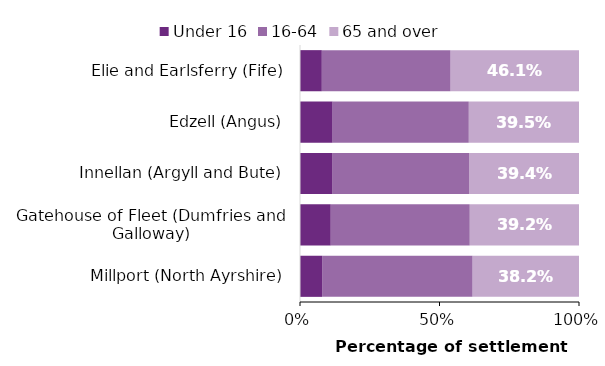
| Category | Under 16 | 16-64 | 65 and over |
|---|---|---|---|
| Millport (North Ayrshire) | 0.079 | 0.538 | 0.382 |
| Gatehouse of Fleet (Dumfries and Galloway) | 0.11 | 0.498 | 0.392 |
| Innellan (Argyll and Bute) | 0.115 | 0.491 | 0.394 |
| Edzell (Angus) | 0.117 | 0.488 | 0.395 |
| Elie and Earlsferry (Fife) | 0.078 | 0.461 | 0.461 |